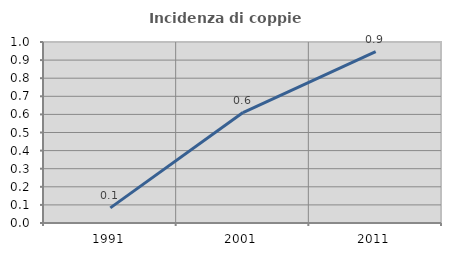
| Category | Incidenza di coppie miste |
|---|---|
| 1991.0 | 0.083 |
| 2001.0 | 0.61 |
| 2011.0 | 0.947 |